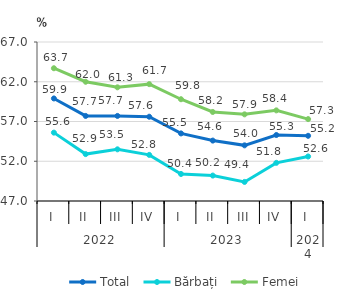
| Category | Total | Bărbați | Femei |
|---|---|---|---|
| 0 | 59.9 | 55.6 | 63.7 |
| 1 | 57.7 | 52.9 | 62 |
| 2 | 57.7 | 53.5 | 61.3 |
| 3 | 57.6 | 52.8 | 61.7 |
| 4 | 55.5 | 50.4 | 59.8 |
| 5 | 54.6 | 50.2 | 58.2 |
| 6 | 54 | 49.4 | 57.9 |
| 7 | 55.3 | 51.8 | 58.4 |
| 8 | 55.2 | 52.6 | 57.3 |